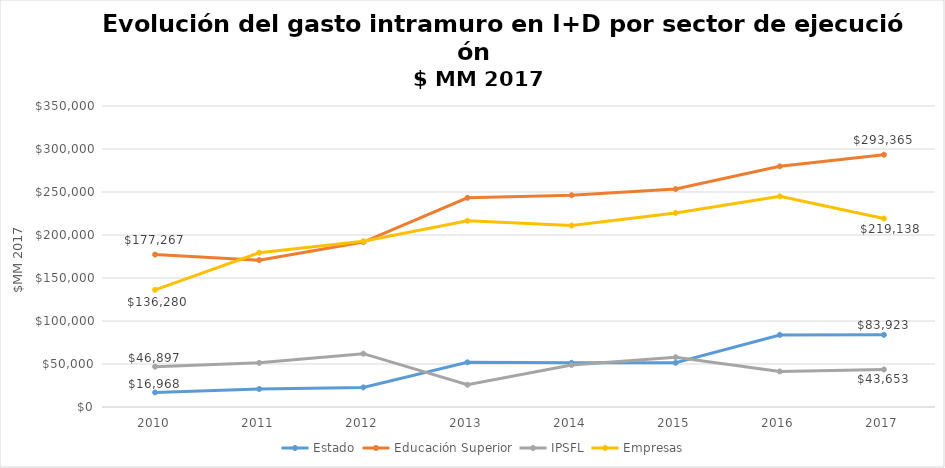
| Category | Estado | Educación Superior | IPSFL | Empresas |
|---|---|---|---|---|
| 2010.0 | 16967.709 | 177267.239 | 46897.403 | 136279.95 |
| 2011.0 | 20943.972 | 170769.939 | 51340.963 | 179382.307 |
| 2012.0 | 22815.846 | 191794.814 | 62011.889 | 192690.957 |
| 2013.0 | 51953.614 | 243284.995 | 25847.97 | 216537.83 |
| 2014.0 | 51467.93 | 246226.975 | 48727.003 | 210944.629 |
| 2015.0 | 51386.552 | 253439.474 | 57869.969 | 225671.45 |
| 2016.0 | 83803.072 | 279835.895 | 41306.334 | 244921.297 |
| 2017.0 | 83922.564 | 293364.985 | 43652.692 | 219137.632 |